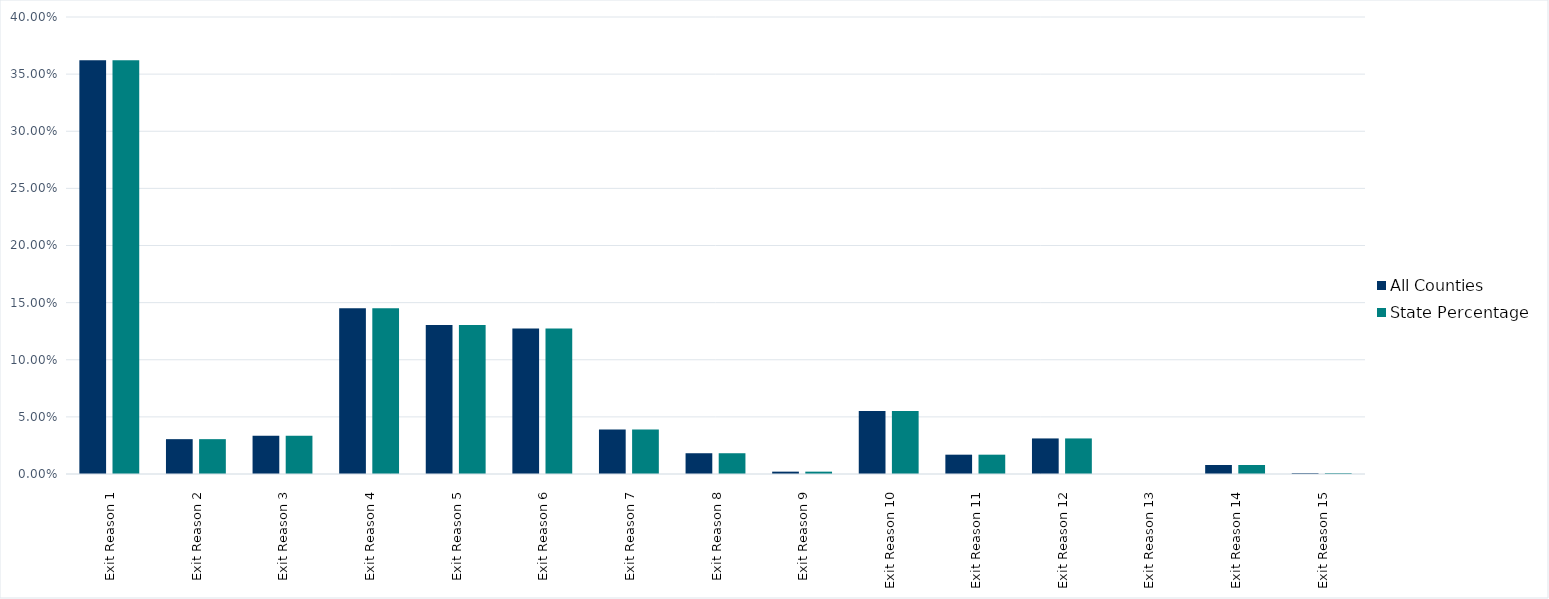
| Category | All Counties | State Percentage |
|---|---|---|
| Exit Reason 1 | 0.362 | 0.362 |
| Exit Reason 2 | 0.03 | 0.03 |
| Exit Reason 3 | 0.034 | 0.034 |
| Exit Reason 4 | 0.145 | 0.145 |
| Exit Reason 5 | 0.13 | 0.13 |
| Exit Reason 6 | 0.127 | 0.127 |
| Exit Reason 7 | 0.039 | 0.039 |
| Exit Reason 8 | 0.018 | 0.018 |
| Exit Reason 9 | 0.002 | 0.002 |
| Exit Reason 10 | 0.055 | 0.055 |
| Exit Reason 11 | 0.017 | 0.017 |
| Exit Reason 12 | 0.031 | 0.031 |
| Exit Reason 13 | 0 | 0 |
| Exit Reason 14 | 0.008 | 0.008 |
| Exit Reason 15 | 0.001 | 0.001 |